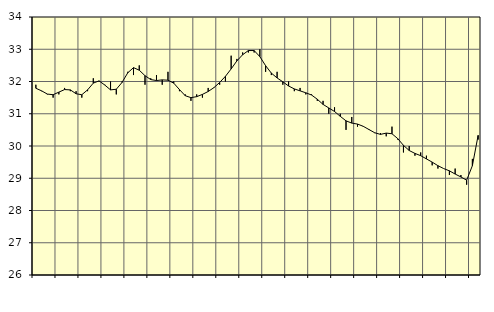
| Category | Piggar | Series 1 |
|---|---|---|
| nan | 31.9 | 31.79 |
| 1.0 | 31.7 | 31.71 |
| 1.0 | 31.6 | 31.61 |
| 1.0 | 31.5 | 31.59 |
| nan | 31.6 | 31.67 |
| 2.0 | 31.8 | 31.75 |
| 2.0 | 31.7 | 31.74 |
| 2.0 | 31.7 | 31.62 |
| nan | 31.5 | 31.59 |
| 3.0 | 31.7 | 31.74 |
| 3.0 | 32.1 | 31.95 |
| 3.0 | 32 | 32.02 |
| nan | 31.9 | 31.89 |
| 4.0 | 32 | 31.74 |
| 4.0 | 31.6 | 31.76 |
| 4.0 | 32 | 31.97 |
| nan | 32.3 | 32.27 |
| 5.0 | 32.2 | 32.43 |
| 5.0 | 32.5 | 32.35 |
| 5.0 | 31.9 | 32.18 |
| nan | 32.1 | 32.06 |
| 6.0 | 32.2 | 32.03 |
| 6.0 | 31.9 | 32.05 |
| 6.0 | 32.3 | 32.04 |
| nan | 32 | 31.95 |
| 7.0 | 31.7 | 31.75 |
| 7.0 | 31.6 | 31.56 |
| 7.0 | 31.4 | 31.5 |
| nan | 31.6 | 31.53 |
| 8.0 | 31.5 | 31.6 |
| 8.0 | 31.8 | 31.69 |
| 8.0 | 31.8 | 31.81 |
| nan | 31.9 | 31.97 |
| 9.0 | 32 | 32.16 |
| 9.0 | 32.8 | 32.39 |
| 9.0 | 32.7 | 32.64 |
| nan | 32.9 | 32.83 |
| 10.0 | 32.9 | 32.96 |
| 10.0 | 32.9 | 32.96 |
| 10.0 | 33 | 32.77 |
| nan | 32.3 | 32.49 |
| 11.0 | 32.2 | 32.26 |
| 11.0 | 32.3 | 32.11 |
| 11.0 | 31.9 | 31.99 |
| nan | 32 | 31.86 |
| 12.0 | 31.7 | 31.77 |
| 12.0 | 31.8 | 31.71 |
| 12.0 | 31.6 | 31.65 |
| nan | 31.6 | 31.58 |
| 13.0 | 31.4 | 31.45 |
| 13.0 | 31.4 | 31.29 |
| 13.0 | 31 | 31.18 |
| nan | 31.2 | 31.07 |
| 14.0 | 31 | 30.92 |
| 14.0 | 30.5 | 30.78 |
| 14.0 | 30.9 | 30.71 |
| nan | 30.6 | 30.68 |
| 15.0 | 30.6 | 30.61 |
| 15.0 | 30.5 | 30.51 |
| 15.0 | 30.4 | 30.41 |
| nan | 30.4 | 30.36 |
| 16.0 | 30.3 | 30.4 |
| 16.0 | 30.6 | 30.38 |
| 16.0 | 30.2 | 30.23 |
| nan | 29.8 | 30.02 |
| 17.0 | 30 | 29.86 |
| 17.0 | 29.7 | 29.77 |
| 17.0 | 29.8 | 29.7 |
| nan | 29.7 | 29.6 |
| 18.0 | 29.4 | 29.5 |
| 18.0 | 29.3 | 29.39 |
| 18.0 | 29.3 | 29.3 |
| nan | 29.1 | 29.23 |
| 19.0 | 29.3 | 29.13 |
| 19.0 | 29.1 | 29.04 |
| 19.0 | 28.8 | 28.94 |
| nan | 29.6 | 29.39 |
| 20.0 | 30.2 | 30.33 |